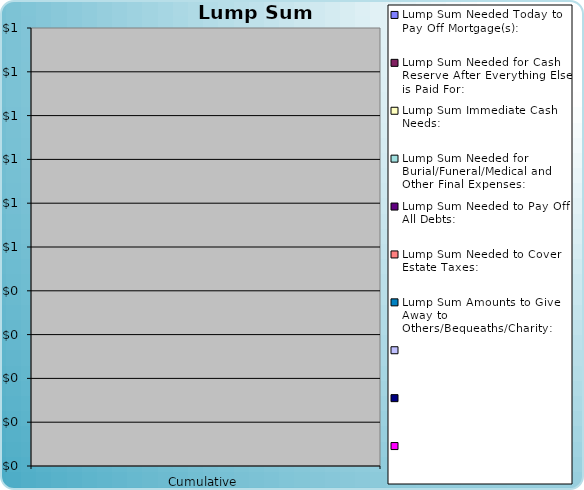
| Category |   | Lump Sum Amounts to Give Away to Others/Bequeaths/Charity: | Lump Sum Needed to Cover Estate Taxes: | Lump Sum Needed to Pay Off All Debts: | Lump Sum Needed for Burial/Funeral/Medical and Other Final Expenses: | Lump Sum Immediate Cash Needs: | Lump Sum Needed for Cash Reserve After Everything Else is Paid For: | Lump Sum Needed Today to Pay Off Mortgage(s): |
|---|---|---|---|---|---|---|---|---|
| 0 | 0 | 0 | 0 | 0 | 0 | 0 | 0 | 0 |